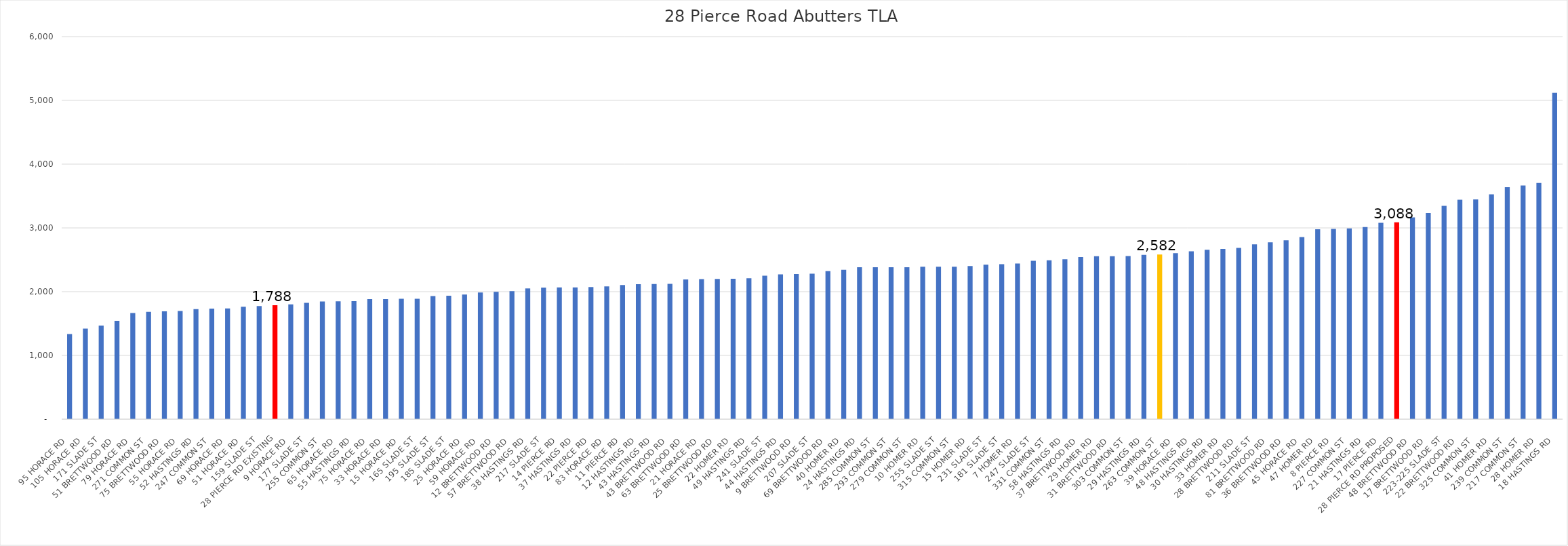
| Category |  TLA  |
|---|---|
| 95 HORACE RD  | 1335 |
| 105 HORACE RD  | 1420 |
| 171 SLADE ST  | 1467 |
| 51 BRETTWOOD RD  | 1542 |
| 79 HORACE RD  | 1664 |
| 271 COMMON ST  | 1684 |
| 75 BRETTWOOD RD  | 1692 |
| 55 HORACE RD  | 1698 |
| 52 HASTINGS RD  | 1727 |
| 247 COMMON ST  | 1733 |
| 69 HORACE RD  | 1737 |
| 51 HORACE RD  | 1762 |
| 159 SLADE ST  | 1774 |
| 28 PIERCE RD EXISTING | 1788 |
| 9 HORACE RD  | 1800 |
| 177 SLADE ST  | 1824 |
| 255 COMMON ST  | 1846 |
| 65 HORACE RD  | 1848 |
| 55 HASTINGS RD  | 1851 |
| 75 HORACE RD  | 1882 |
| 33 HORACE RD  | 1883 |
| 15 HORACE RD  | 1888 |
| 165 SLADE ST  | 1888 |
| 195 SLADE ST  | 1931 |
| 185 SLADE ST  | 1937 |
| 25 HORACE RD  | 1956 |
| 59 HORACE RD  | 1988 |
| 12 BRETTWOOD RD  | 1998 |
| 57 BRETTWOOD RD  | 2008 |
| 38 HASTINGS RD  | 2051 |
| 217 SLADE ST  | 2064 |
| 14 PIERCE RD  | 2066 |
| 37 HASTINGS RD  | 2066 |
| 22 PIERCE RD  | 2072 |
| 83 HORACE RD  | 2082 |
| 11 PIERCE RD  | 2104 |
| 12 HASTINGS RD  | 2118 |
| 43 HASTINGS RD  | 2119 |
| 43 BRETTWOOD RD  | 2122 |
| 63 BRETTWOOD RD  | 2191 |
| 21 HORACE RD  | 2197 |
| 25 BRETTWOOD RD  | 2200 |
| 22 HOMER RD  | 2201 |
| 49 HASTINGS RD  | 2211 |
| 241 SLADE ST  | 2250 |
| 44 HASTINGS RD  | 2272 |
| 9 BRETTWOOD RD  | 2276 |
| 207 SLADE ST  | 2282 |
| 69 BRETTWOOD RD  | 2322 |
| 40 HOMER RD  | 2342 |
| 24 HASTINGS RD  | 2382 |
| 285 COMMON ST  | 2383 |
| 293 COMMON ST  | 2383 |
| 279 COMMON ST  | 2384 |
| 10 HOMER RD  | 2390 |
| 255 SLADE ST  | 2390 |
| 315 COMMON ST  | 2390 |
| 15 HOMER RD  | 2402 |
| 231 SLADE ST  | 2422 |
| 181 SLADE ST  | 2430 |
| 7 HOMER RD  | 2441 |
| 247 SLADE ST  | 2483 |
| 331 COMMON ST  | 2493 |
| 58 HASTINGS RD  | 2509 |
| 37 BRETTWOOD RD  | 2542 |
| 29 HOMER RD  | 2555 |
| 31 BRETTWOOD RD  | 2555 |
| 303 COMMON ST  | 2558 |
| 29 HASTINGS RD  | 2578 |
| 263 COMMON ST  | 2582 |
| 39 HORACE RD  | 2604 |
| 48 HASTINGS RD  | 2633 |
| 30 HASTINGS RD  | 2656 |
| 33 HOMER RD  | 2669 |
| 28 BRETTWOOD RD  | 2686 |
| 211 SLADE ST  | 2743 |
| 81 BRETTWOOD RD  | 2773 |
| 36 BRETTWOOD RD  | 2805 |
| 45 HORACE RD  | 2856 |
| 47 HOMER RD  | 2980 |
| 8 PIERCE RD  | 2985 |
| 227 COMMON ST  | 2991 |
| 21 HASTINGS RD  | 3014 |
| 17 PIERCE RD  | 3080 |
| 28 PIERCE RD PROPOSED | 3088 |
| 48 BRETTWOOD RD  | 3164 |
| 17 BRETTWOOD RD  | 3234 |
| 223-225 SLADE ST  | 3346 |
| 22 BRETTWOOD RD  | 3442 |
| 325 COMMON ST  | 3446 |
| 41 HOMER RD  | 3527 |
| 239 COMMON ST  | 3638 |
| 217 COMMON ST  | 3664 |
| 28 HOMER RD  | 3706 |
| 18 HASTINGS RD  | 5119 |